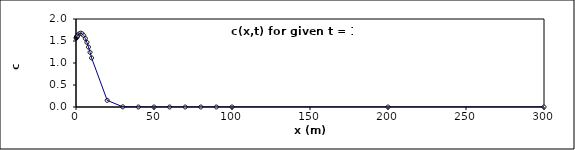
| Category | Series 0 |
|---|---|
| 0.1 | 1.564 |
| 0.2 | 1.572 |
| 0.3 | 1.579 |
| 0.4 | 1.586 |
| 0.5 | 1.592 |
| 0.6 | 1.599 |
| 0.7 | 1.605 |
| 0.8 | 1.611 |
| 0.9 | 1.617 |
| 1.0 | 1.623 |
| 2.0 | 1.664 |
| 3.0 | 1.678 |
| 4.0 | 1.664 |
| 5.0 | 1.623 |
| 6.0 | 1.556 |
| 7.0 | 1.468 |
| 8.0 | 1.362 |
| 9.0 | 1.243 |
| 10.0 | 1.115 |
| 20.0 | 0.151 |
| 30.0 | 0.004 |
| 40.0 | 0 |
| 50.0 | 0 |
| 60.0 | 0 |
| 70.0 | 0 |
| 80.0 | 0 |
| 90.0 | 0 |
| 100.0 | 0 |
| 200.0 | 0 |
| 300.0 | 0 |
| 400.0 | 0 |
| 500.0 | 0 |
| 600.0 | 0 |
| 700.0 | 0 |
| 800.0 | 0 |
| 900.0 | 0 |
| 1000.0 | 0 |